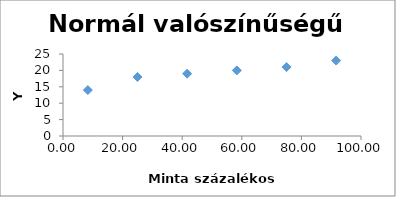
| Category | Series 0 |
|---|---|
| 8.333333333333334 | 14 |
| 25.0 | 18 |
| 41.66666666666667 | 19 |
| 58.333333333333336 | 20 |
| 75.0 | 21 |
| 91.66666666666667 | 23 |